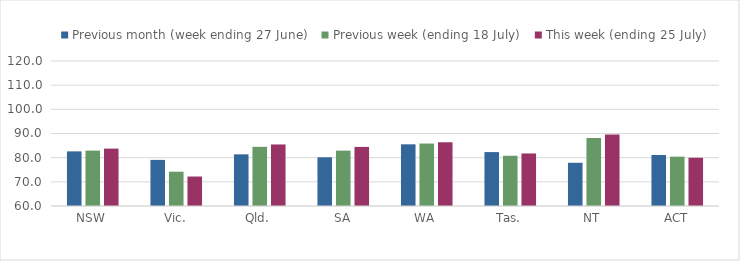
| Category | Previous month (week ending 27 June) | Previous week (ending 18 July) | This week (ending 25 July) |
|---|---|---|---|
| NSW | 82.607 | 82.925 | 83.748 |
| Vic. | 79.073 | 74.189 | 72.198 |
| Qld. | 81.379 | 84.484 | 85.466 |
| SA | 80.153 | 82.906 | 84.451 |
| WA | 85.523 | 85.843 | 86.369 |
| Tas. | 82.308 | 80.786 | 81.739 |
| NT | 77.883 | 88.141 | 89.602 |
| ACT | 81.096 | 80.416 | 79.971 |